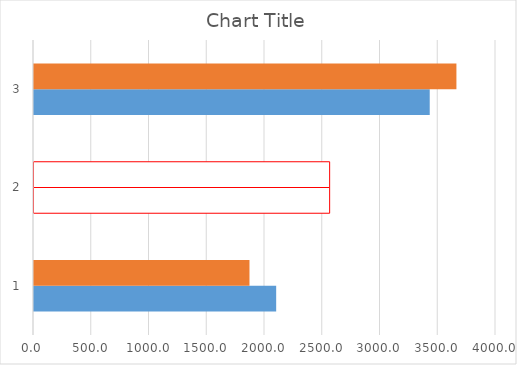
| Category | Series 0 | Series 1 |
|---|---|---|
| 0 | 2096.791 | 1865.657 |
| 1 | 2559.7 | 2559.7 |
| 2 | 3426.209 | 3657.343 |